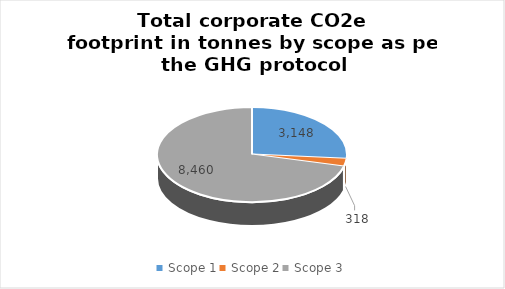
| Category | Series 0 |
|---|---|
| Scope 1 | 3147.8 |
| Scope 2 | 317.5 |
| Scope 3 | 8460 |